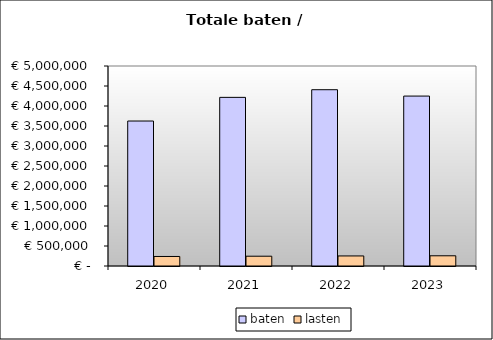
| Category | baten | lasten |
|---|---|---|
| 2020.0 | 3624420.739 | 238012.8 |
| 2021.0 | 4215834.474 | 244577.6 |
| 2022.0 | 4407375.499 | 251268.8 |
| 2023.0 | 4248119.084 | 255211.2 |